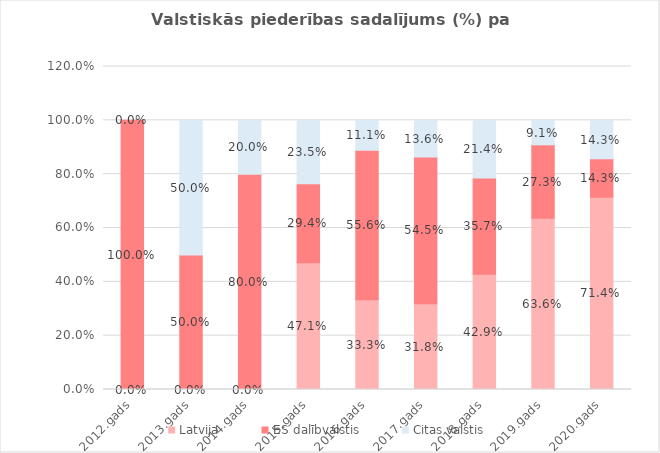
| Category | Latvija | ES dalībvalstis | Citas valstis |
|---|---|---|---|
| 2012.gads | 0 | 1 | 0 |
| 2013.gads | 0 | 0.5 | 0.5 |
| 2014.gads | 0 | 0.8 | 0.2 |
| 2015.gads | 0.471 | 0.294 | 0.235 |
| 2016.gads | 0.333 | 0.556 | 0.111 |
| 2017.gads | 0.318 | 0.545 | 0.136 |
| 2018.gads | 0.429 | 0.357 | 0.214 |
| 2019.gads | 0.636 | 0.273 | 0.091 |
| 2020.gads | 0.714 | 0.143 | 0.143 |